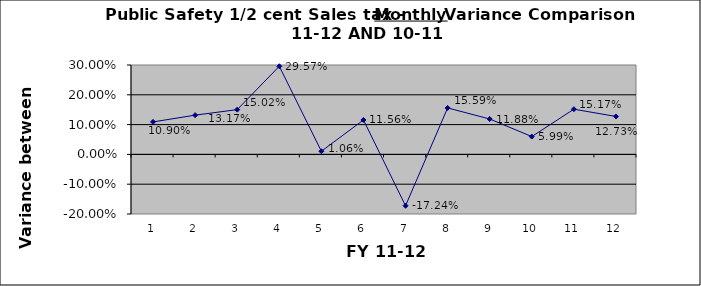
| Category | September October November December January February March April May June  July August |
|---|---|
| 0 | 0.109 |
| 1 | 0.132 |
| 2 | 0.15 |
| 3 | 0.296 |
| 4 | 0.011 |
| 5 | 0.116 |
| 6 | -0.172 |
| 7 | 0.156 |
| 8 | 0.119 |
| 9 | 0.06 |
| 10 | 0.152 |
| 11 | 0.127 |